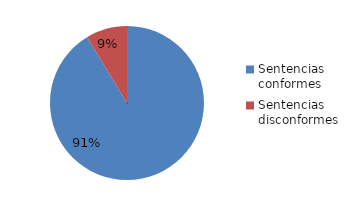
| Category | Series 0 |
|---|---|
| Sentencias conformes | 158 |
| Sentencias disconformes | 15 |